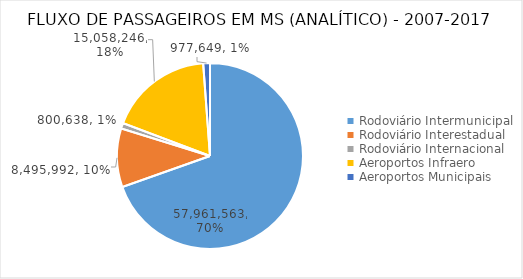
| Category | Series 0 |
|---|---|
| Rodoviário Intermunicipal | 57961563 |
| Rodoviário Interestadual | 8495991.66 |
| Rodoviário Internacional | 800638.239 |
| Aeroportos Infraero | 15058246 |
| Aeroportos Municipais | 977649 |